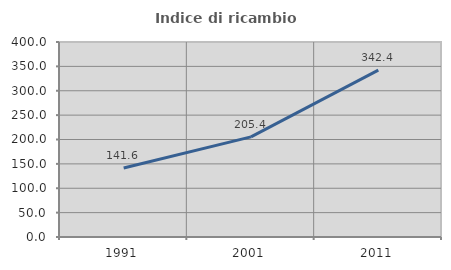
| Category | Indice di ricambio occupazionale  |
|---|---|
| 1991.0 | 141.641 |
| 2001.0 | 205.357 |
| 2011.0 | 342.408 |